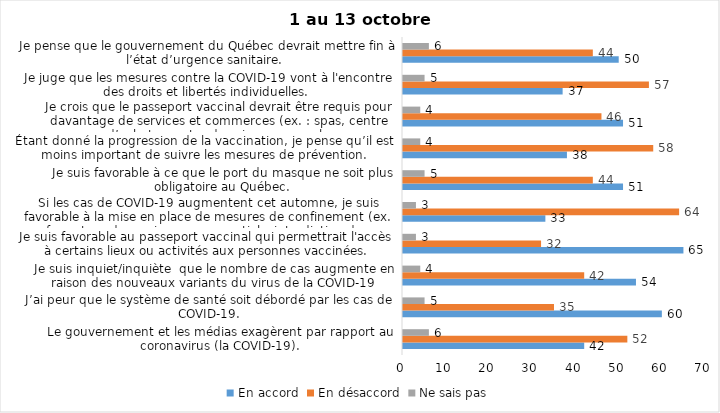
| Category | En accord | En désaccord | Ne sais pas |
|---|---|---|---|
| Le gouvernement et les médias exagèrent par rapport au coronavirus (la COVID-19). | 42 | 52 | 6 |
| J’ai peur que le système de santé soit débordé par les cas de COVID-19. | 60 | 35 | 5 |
| Je suis inquiet/inquiète  que le nombre de cas augmente en raison des nouveaux variants du virus de la COVID-19 | 54 | 42 | 4 |
| Je suis favorable au passeport vaccinal qui permettrait l'accès à certains lieux ou activités aux personnes vaccinées. | 65 | 32 | 3 |
| Si les cas de COVID-19 augmentent cet automne, je suis favorable à la mise en place de mesures de confinement (ex. fermeture de services non essentiels, interdiction des rassemblements privés) | 33 | 64 | 3 |
| Je suis favorable à ce que le port du masque ne soit plus obligatoire au Québec. | 51 | 44 | 5 |
| Étant donné la progression de la vaccination, je pense qu’il est moins important de suivre les mesures de prévention. | 38 | 58 | 4 |
| Je crois que le passeport vaccinal devrait être requis pour davantage de services et commerces (ex. : spas, centre d’achats, centre de soins personnels. | 51 | 46 | 4 |
| Je juge que les mesures contre la COVID-19 vont à l'encontre des droits et libertés individuelles.  | 37 | 57 | 5 |
| Je pense que le gouvernement du Québec devrait mettre fin à l’état d’urgence sanitaire.  | 50 | 44 | 6 |